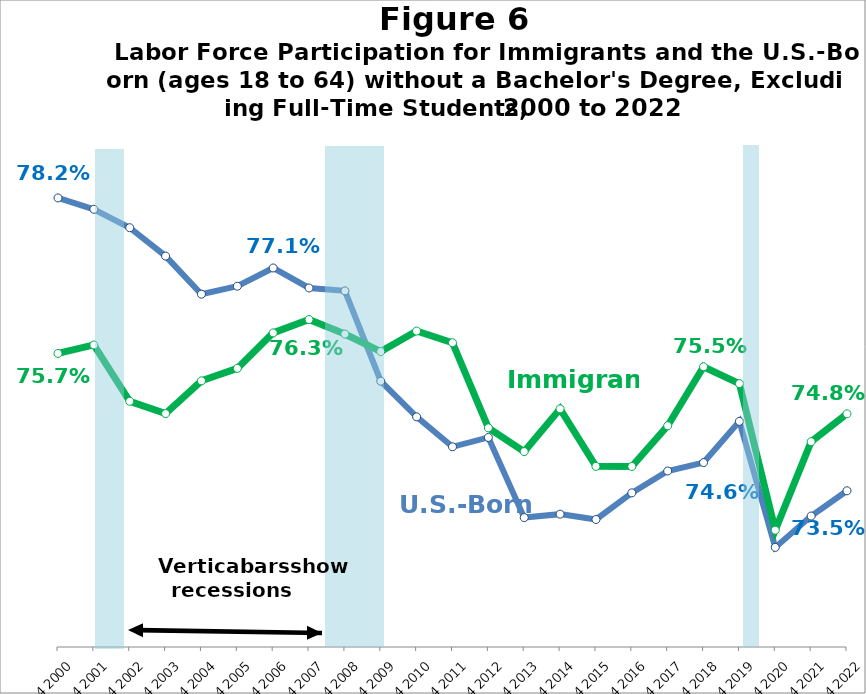
| Category | Native | Immigrant |
|---|---|---|
| Q4 2000 | 0.782 | 0.757 |
| Q4 2001 | 0.78 | 0.759 |
| Q4 2002 | 0.777 | 0.75 |
| Q4 2003 | 0.773 | 0.748 |
| Q4 2004 | 0.767 | 0.753 |
| Q4 2005 | 0.768 | 0.755 |
| Q4 2006 | 0.771 | 0.761 |
| Q4 2007 | 0.768 | 0.763 |
| Q4 2008 | 0.767 | 0.76 |
| Q4 2009 | 0.753 | 0.758 |
| Q4 2010 | 0.747 | 0.761 |
| Q4 2011 | 0.742 | 0.759 |
| Q4 2012 | 0.744 | 0.745 |
| Q4 2013 | 0.731 | 0.741 |
| Q4 2014 | 0.731 | 0.748 |
| Q4 2015 | 0.731 | 0.739 |
| Q4 2016 | 0.735 | 0.739 |
| Q4 2017 | 0.738 | 0.746 |
| Q4 2018 | 0.74 | 0.755 |
| Q4 2019 | 0.746 | 0.752 |
| Q4 2020 | 0.726 | 0.729 |
| Q4 2021 | 0.731 | 0.743 |
| Q4 2022 | 0.735 | 0.748 |